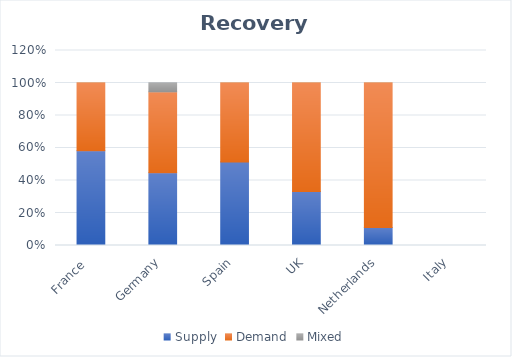
| Category | Supply | Demand | Mixed |
|---|---|---|---|
| France  | 0.582 | 0.418 | 0 |
| Germany | 0.448 | 0.497 | 0.055 |
| Spain | 0.513 | 0.487 | 0 |
| UK | 0.332 | 0.668 | 0 |
| Netherlands | 0.111 | 0.889 | 0 |
| Italy | 0 | 0 | 0 |